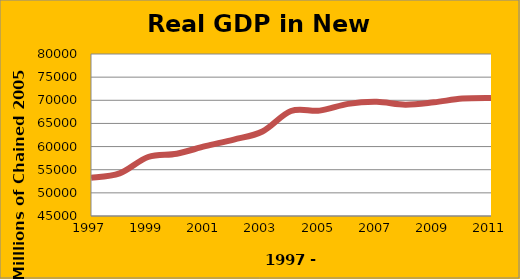
| Category | Real GDP in New Mexico |
|---|---|
| 1997.0 | 53246 |
| 1998.0 | 54200 |
| 1999.0 | 57749 |
| 2000.0 | 58461 |
| 2001.0 | 60084 |
| 2002.0 | 61520 |
| 2003.0 | 63267 |
| 2004.0 | 67681 |
| 2005.0 | 67763 |
| 2006.0 | 69232 |
| 2007.0 | 69668 |
| 2008.0 | 69047 |
| 2009.0 | 69554 |
| 2010.0 | 70369 |
| 2011.0 | 70497 |